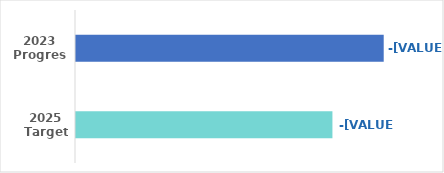
| Category | Series 0 |
|---|---|
| 2023 Progress | 0.7 |
| 2025 Target | 0.6 |